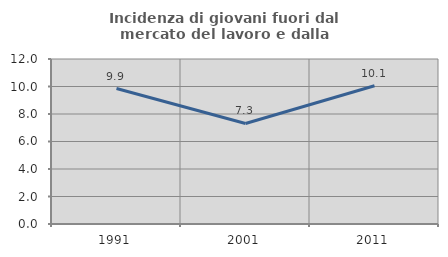
| Category | Incidenza di giovani fuori dal mercato del lavoro e dalla formazione  |
|---|---|
| 1991.0 | 9.851 |
| 2001.0 | 7.313 |
| 2011.0 | 10.053 |